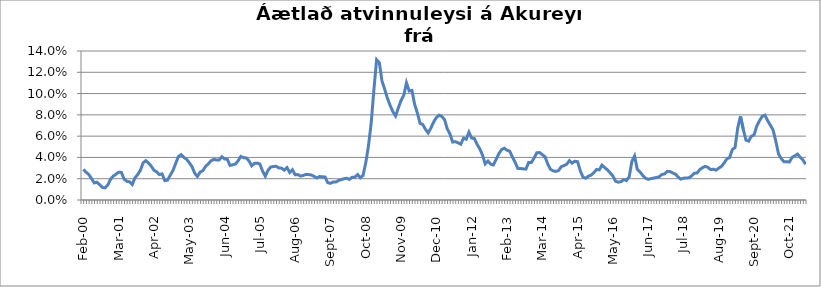
| Category | Series 0 |
|---|---|
| feb.00 | 0.029 |
| mar.00 | 0.026 |
| apr.00 | 0.024 |
| maí.00 | 0.02 |
| jún.00 | 0.016 |
| júl.00 | 0.017 |
| ágú.00 | 0.014 |
| sep.00 | 0.012 |
| okt.00 | 0.011 |
| nóv.00 | 0.014 |
| des.00 | 0.019 |
| jan.01 | 0.022 |
| feb.01 | 0.024 |
| mar.01 | 0.026 |
| apr.01 | 0.026 |
| maí.01 | 0.02 |
| jún.01 | 0.018 |
| júl.01 | 0.017 |
| ágú.01 | 0.014 |
| sep.01 | 0.021 |
| okt.01 | 0.024 |
| nóv.01 | 0.028 |
| des.01 | 0.035 |
| jan.02 | 0.037 |
| feb.02 | 0.035 |
| mar.02 | 0.032 |
| apr.02 | 0.028 |
| maí.02 | 0.027 |
| jún.02 | 0.024 |
| júl.02 | 0.025 |
| ágú.02 | 0.018 |
| sep.02 | 0.019 |
| okt.02 | 0.023 |
| nóv.02 | 0.028 |
| des.02 | 0.034 |
| jan.03 | 0.041 |
| feb.03 | 0.043 |
| mar.03 | 0.04 |
| apr.03 | 0.038 |
| maí.03 | 0.035 |
| jún.03 | 0.031 |
| júl.03 | 0.025 |
| ágú.03 | 0.022 |
| sep.03 | 0.026 |
| okt.03 | 0.028 |
| nóv.03 | 0.032 |
| des.03 | 0.034 |
| jan.04 | 0.037 |
| feb.04 | 0.038 |
| mar.04 | 0.038 |
| apr.04 | 0.038 |
| maí.04 | 0.041 |
| jún.04 | 0.039 |
| júl.04 | 0.038 |
| ágú.04 | 0.032 |
| sep.04 | 0.033 |
| okt.04 | 0.034 |
| nóv.04 | 0.037 |
| des.04 | 0.041 |
| jan.05 | 0.04 |
| feb.05 | 0.04 |
| mar.05 | 0.037 |
| apr.05 | 0.032 |
| maí.05 | 0.034 |
| jún.05 | 0.035 |
| júl.05 | 0.034 |
| ágú.05 | 0.027 |
| sep.05 | 0.022 |
| okt.05 | 0.028 |
| nóv.05 | 0.031 |
| des.05 | 0.031 |
| jan.06 | 0.032 |
| feb.06 | 0.03 |
| mar.06 | 0.03 |
| apr.06 | 0.028 |
| maí.06 | 0.03 |
| jún.06 | 0.026 |
| júl.06 | 0.028 |
| ágú.06 | 0.024 |
| sep.06 | 0.024 |
| okt.06 | 0.022 |
| nóv.06 | 0.023 |
| des.06 | 0.024 |
| jan.07 | 0.024 |
| feb.07 | 0.024 |
| mar.07 | 0.022 |
| apr.07 | 0.021 |
| maí.07 | 0.022 |
| jún.07 | 0.022 |
| júl.07 | 0.022 |
| ágú.07 | 0.016 |
| sep.07 | 0.016 |
| okt.07 | 0.017 |
| nóv.07 | 0.017 |
| des.07 | 0.018 |
| jan.08 | 0.019 |
| feb.08 | 0.02 |
| mar.08 | 0.02 |
| apr.08 | 0.019 |
| maí.08 | 0.021 |
| jún.08 | 0.021 |
| júl.08 | 0.024 |
| ágú.08 | 0.021 |
| sep.08 | 0.023 |
| okt.08 | 0.035 |
| nóv.08 | 0.051 |
| des.08 | 0.072 |
| jan.09 | 0.104 |
| feb.09 | 0.132 |
| mar.09 | 0.129 |
| apr.09 | 0.111 |
| maí.09 | 0.104 |
| jún.09 | 0.096 |
| júl.09 | 0.089 |
| ágú.09 | 0.083 |
| sep.09 | 0.079 |
| okt.09 | 0.087 |
| nóv.09 | 0.094 |
| des.09 | 0.098 |
| jan.10 | 0.11 |
| feb.10 | 0.102 |
| mar.10 | 0.103 |
| apr.10 | 0.09 |
| maí.10 | 0.082 |
| jún.10 | 0.072 |
| júl.10 | 0.071 |
| ágú.10 | 0.066 |
| sep.10 | 0.063 |
| okt.10 | 0.068 |
| nóv.10 | 0.073 |
| des.10 | 0.077 |
| jan.11 | 0.08 |
| feb.11 | 0.078 |
| mar.11 | 0.076 |
| apr.11 | 0.067 |
| maí.11 | 0.062 |
| jún.11 | 0.054 |
| júl.11 | 0.055 |
| ágú.11 | 0.054 |
| sep.11 | 0.052 |
| okt.11 | 0.058 |
| nóv.11 | 0.057 |
| des.11 | 0.064 |
| jan.12 | 0.058 |
| feb.12 | 0.058 |
| mar.12 | 0.052 |
| apr.12 | 0.048 |
| maí.12 | 0.042 |
| jún.12 | 0.034 |
| júl.12 | 0.037 |
| ágú.12 | 0.034 |
| sep.12 | 0.033 |
| okt.12 | 0.038 |
| nóv.12 | 0.043 |
| des.12 | 0.047 |
| jan.13 | 0.049 |
| feb.13 | 0.047 |
| mar.13 | 0.046 |
| apr.13 | 0.04 |
| maí.13 | 0.036 |
| jún.13 | 0.03 |
| júl.13 | 0.03 |
| ágú.13 | 0.029 |
| sep.13 | 0.029 |
| okt.13 | 0.035 |
| nóv.13 | 0.035 |
| des.13 | 0.039 |
| jan.14 | 0.044 |
| feb.14 | 0.045 |
| mar.14 | 0.043 |
| apr.14 | 0.041 |
| maí.14 | 0.034 |
| jún.14 | 0.029 |
| júl.14 | 0.027 |
| ágú.14 | 0.027 |
| sep.14 | 0.028 |
| okt.14 | 0.031 |
| nóv.14 | 0.032 |
| des.14 | 0.034 |
| jan.15 | 0.037 |
| feb.15 | 0.035 |
| mar.15 | 0.036 |
| apr.15 | 0.036 |
| maí.15 | 0.028 |
| jún.15 | 0.021 |
| júl.15 | 0.02 |
| ágú.15 | 0.022 |
| sep.15 | 0.023 |
| okt.15 | 0.026 |
| nóv.15 | 0.029 |
| des.15 | 0.028 |
| jan.16 | 0.033 |
| feb.16 | 0.03 |
| mar.16 | 0.028 |
| apr.16 | 0.026 |
| maí.16 | 0.023 |
| jún.16 | 0.018 |
| júl.16 | 0.017 |
| ágú.16 | 0.017 |
| sep.16 | 0.019 |
| okt.16 | 0.018 |
| nóv.16 | 0.022 |
| des.16 | 0.036 |
| jan.17 | 0.041 |
| feb.17 | 0.029 |
| mar.17 | 0.026 |
| apr.17 | 0.023 |
| maí.17 | 0.02 |
| jún.17 | 0.019 |
| júl.17 | 0.02 |
| ágú.17 | 0.021 |
| sep.17 | 0.021 |
| okt.17 | 0.022 |
| nóv.17 | 0.024 |
| des.17 | 0.024 |
| jan.18 | 0.027 |
| feb.18 | 0.027 |
| mar.18 | 0.025 |
| apr.18 | 0.024 |
| maí.18 | 0.022 |
| jún.18 | 0.02 |
| júl.18 | 0.021 |
| ágú.18 | 0.021 |
| sep.18 | 0.021 |
| okt.18 | 0.023 |
| nóv.18 | 0.025 |
| des.18 | 0.025 |
| jan.19 | 0.029 |
| feb.19 | 0.03 |
| mar.19 | 0.032 |
| apr.19 | 0.031 |
| maí.19 | 0.029 |
| jún.19 | 0.029 |
| júl.19 | 0.028 |
| ágú.19 | 0.03 |
| sep.19 | 0.032 |
| okt.19 | 0.035 |
| nóv.19 | 0.039 |
| des.19 | 0.04 |
| jan.20 | 0.047 |
| feb.20 | 0.049 |
| mars 2020*** | 0.068 |
| apr.20 | 0.079 |
| maí.20 | 0.067 |
| jún.20 | 0.056 |
| júl.20 | 0.055 |
| ágú.20 | 0.06 |
| sep.20 | 0.061 |
| okt.20 | 0.07 |
| nóv.20 | 0.074 |
| des.20 | 0.079 |
| jan.21 | 0.08 |
| feb.21 | 0.075 |
| mar.21 | 0.07 |
| apr.21 | 0.066 |
| maí.21 | 0.055 |
| jún.21 | 0.043 |
| júl.21 | 0.039 |
| ágú.21 | 0.036 |
| sep.21 | 0.036 |
| okt.21 | 0.036 |
| nóv.21 | 0.04 |
| des.21 | 0.042 |
| jan.22 | 0.043 |
| feb.22 | 0.04 |
| mar.22 | 0.038 |
| apr.22 | 0.033 |